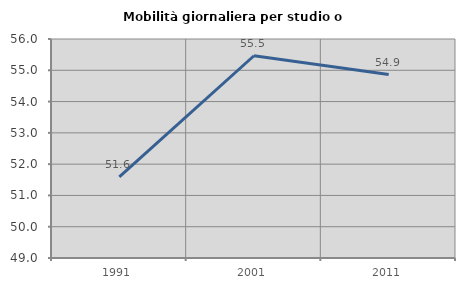
| Category | Mobilità giornaliera per studio o lavoro |
|---|---|
| 1991.0 | 51.592 |
| 2001.0 | 55.465 |
| 2011.0 | 54.862 |